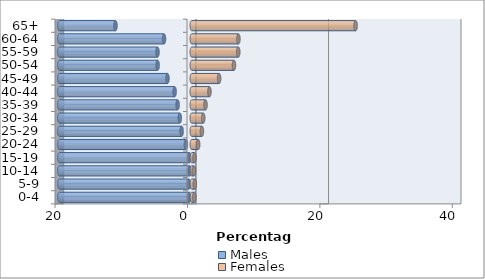
| Category | Males | Females |
|---|---|---|
| 0-4 | -0.378 | 0.374 |
| 5-9 | -0.441 | 0.457 |
| 10-14 | -0.302 | 0.328 |
| 15-19 | -0.364 | 0.403 |
| 20-24 | -0.894 | 0.964 |
| 25-29 | -1.532 | 1.532 |
| 30-34 | -1.811 | 1.727 |
| 35-39 | -2.137 | 2.072 |
| 40-44 | -2.59 | 2.669 |
| 45-49 | -3.672 | 4.129 |
| 50-54 | -5.156 | 6.37 |
| 55-59 | -5.177 | 7.022 |
| 60-64 | -4.194 | 7.044 |
| 65+ | -11.52 | 24.74 |